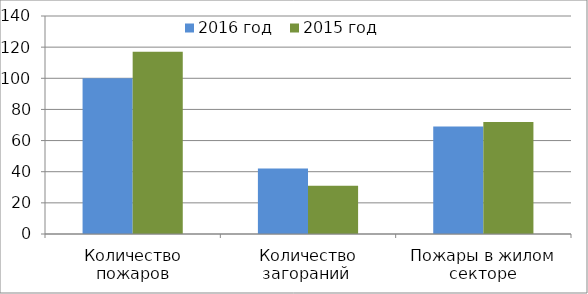
| Category | 2016 год | 2015 год |
|---|---|---|
| Количество пожаров | 100 | 117 |
| Количество загораний  | 42 | 31 |
| Пожары в жилом секторе | 69 | 72 |